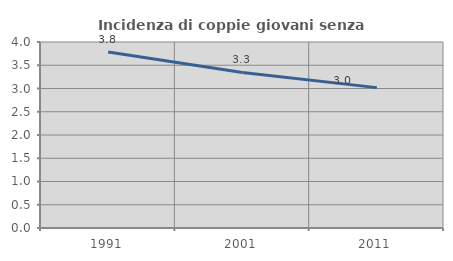
| Category | Incidenza di coppie giovani senza figli |
|---|---|
| 1991.0 | 3.785 |
| 2001.0 | 3.344 |
| 2011.0 | 3.019 |